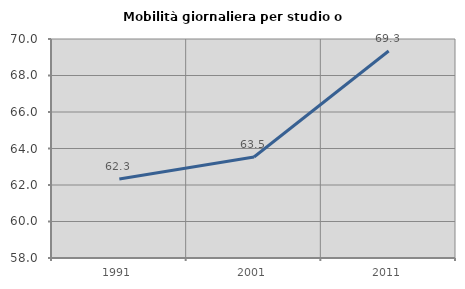
| Category | Mobilità giornaliera per studio o lavoro |
|---|---|
| 1991.0 | 62.326 |
| 2001.0 | 63.533 |
| 2011.0 | 69.34 |